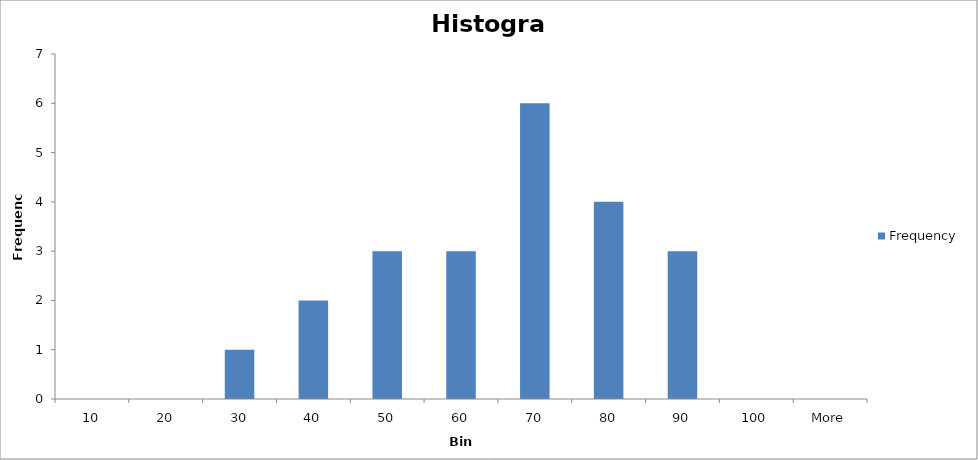
| Category | Frequency |
|---|---|
| 10 | 0 |
| 20 | 0 |
| 30 | 1 |
| 40 | 2 |
| 50 | 3 |
| 60 | 3 |
| 70 | 6 |
| 80 | 4 |
| 90 | 3 |
| 100 | 0 |
| More | 0 |